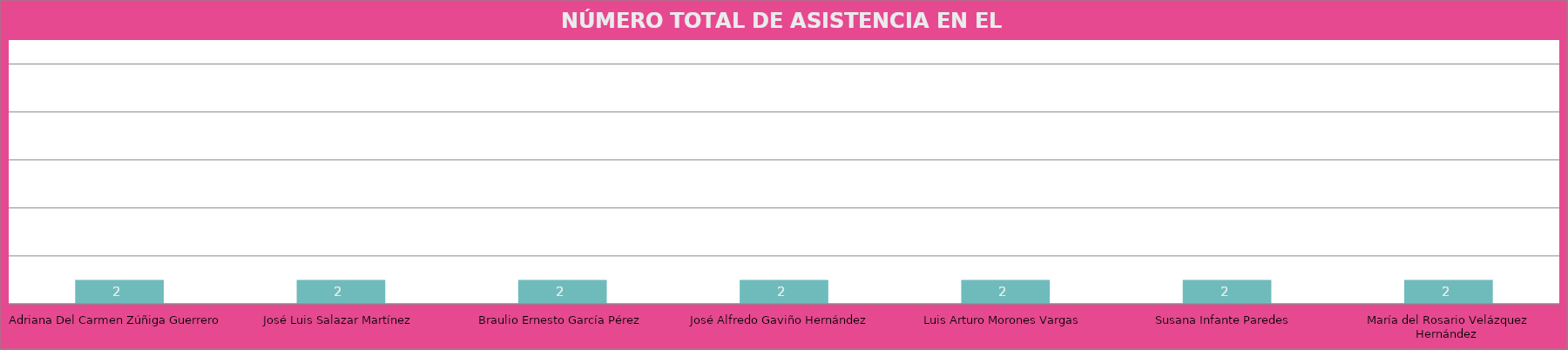
| Category | Adriana Del Carmen Zúñiga Guerrero  |
|---|---|
| Adriana Del Carmen Zúñiga Guerrero  | 2 |
| José Luis Salazar Martínez | 2 |
| Braulio Ernesto García Pérez | 2 |
| José Alfredo Gaviño Hernández  | 2 |
| Luis Arturo Morones Vargas | 2 |
| Susana Infante Paredes  | 2 |
| María del Rosario Velázquez Hernández  | 2 |